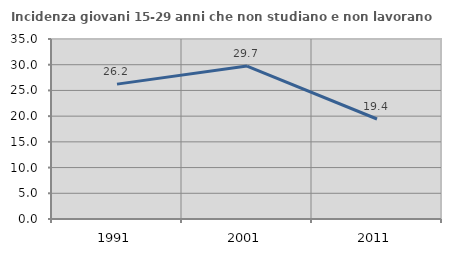
| Category | Incidenza giovani 15-29 anni che non studiano e non lavorano  |
|---|---|
| 1991.0 | 26.225 |
| 2001.0 | 29.747 |
| 2011.0 | 19.444 |